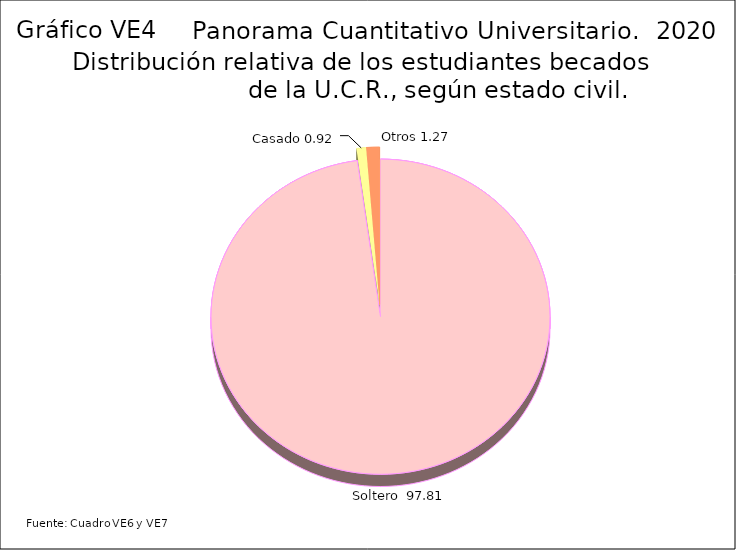
| Category | Series 3 |
|---|---|
| Soltero  | 97.81 |
| Casado | 0.92 |
| Otros | 1.27 |